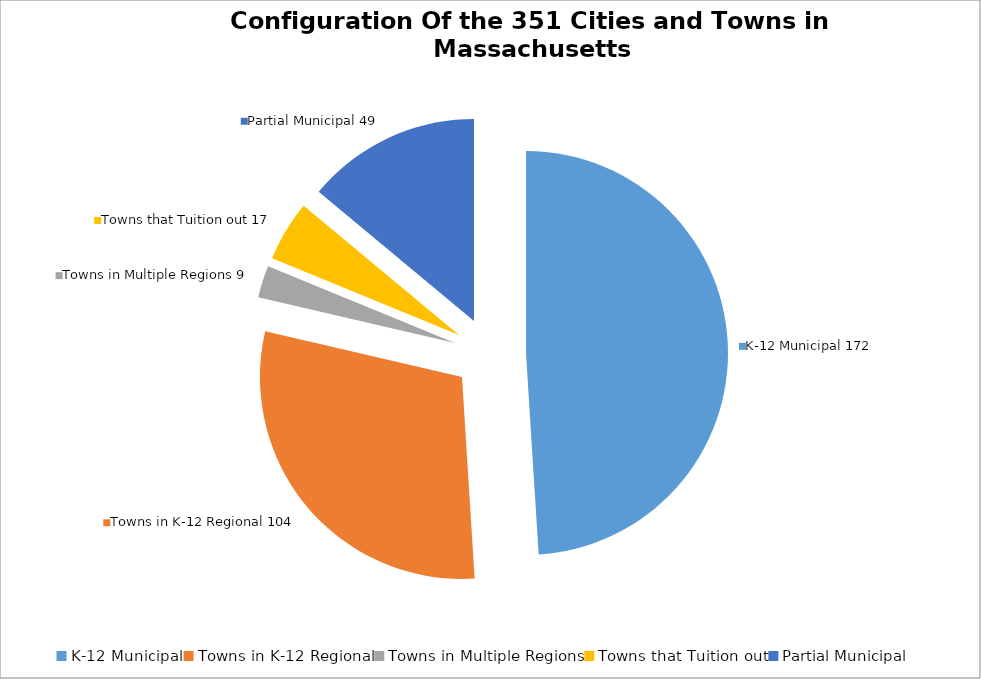
| Category | Number |
|---|---|
| K-12 Municipal | 172 |
| Towns in K-12 Regional | 104 |
| Towns in Multiple Regions | 9 |
| Towns that Tuition out | 17 |
| Partial Municipal | 49 |